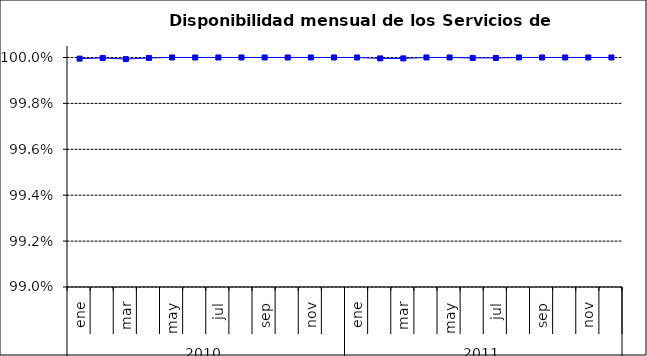
| Category | SCL * |
|---|---|
| 0 | 1 |
| 1 | 1 |
| 2 | 1 |
| 3 | 1 |
| 4 | 1 |
| 5 | 1 |
| 6 | 1 |
| 7 | 1 |
| 8 | 1 |
| 9 | 1 |
| 10 | 1 |
| 11 | 1 |
| 12 | 1 |
| 13 | 1 |
| 14 | 1 |
| 15 | 1 |
| 16 | 1 |
| 17 | 1 |
| 18 | 1 |
| 19 | 1 |
| 20 | 1 |
| 21 | 1 |
| 22 | 1 |
| 23 | 1 |